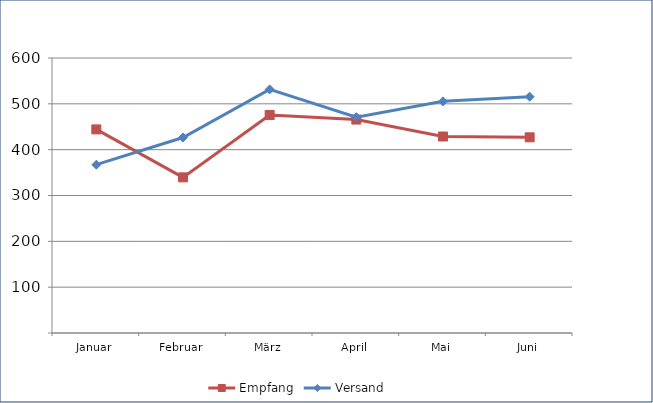
| Category | Empfang | Versand |
|---|---|---|
| Januar | 444.218 | 367.237 |
| Februar | 339.564 | 426.445 |
| März | 475.69 | 531.445 |
| April | 465.704 | 471.047 |
| Mai | 428.721 | 505.409 |
| Juni | 426.924 | 515.619 |